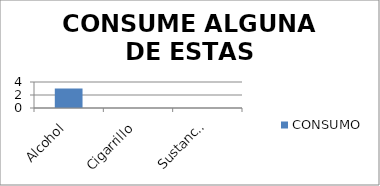
| Category | CONSUMO |
|---|---|
| Alcohol | 3 |
| Cigarrillo | 0 |
| Sustancias psicoactivas | 0 |